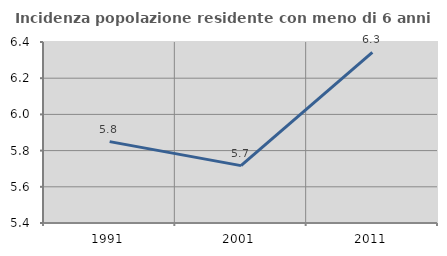
| Category | Incidenza popolazione residente con meno di 6 anni |
|---|---|
| 1991.0 | 5.85 |
| 2001.0 | 5.717 |
| 2011.0 | 6.342 |